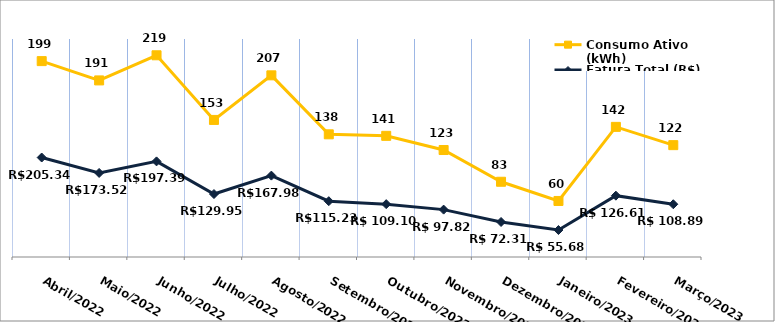
| Category | Fatura Total (R$) | Consumo Ativo (kWh) |
|---|---|---|
| Abril/2022 | 205.34 | 199 |
| Maio/2022 | 173.52 | 191 |
| Junho/2022 | 197.39 | 219 |
| Julho/2022 | 129.95 | 153 |
| Agosto/2022 | 167.98 | 207 |
| Setembro/2022 | 115.23 | 138 |
| Outubro/2022 | 109.1 | 141 |
| Novembro/2022 | 97.82 | 123 |
| Dezembro/2022 | 72.31 | 83 |
| Janeiro/2023 | 55.68 | 60 |
| Fevereiro/2023 | 126.61 | 142 |
| Março/2023 | 108.89 | 122 |